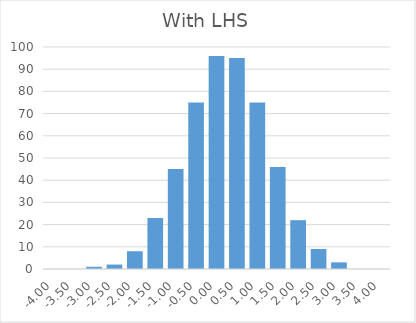
| Category | Series 0 |
|---|---|
| -4.0 | 0 |
| -3.5 | 0 |
| -3.0 | 1 |
| -2.5 | 2 |
| -2.0 | 8 |
| -1.5 | 23 |
| -1.0 | 45 |
| -0.5 | 75 |
| 0.0 | 96 |
| 0.5 | 95 |
| 1.0 | 75 |
| 1.5 | 46 |
| 2.0 | 22 |
| 2.5 | 9 |
| 3.0 | 3 |
| 3.5 | 0 |
| 4.0 | 0 |